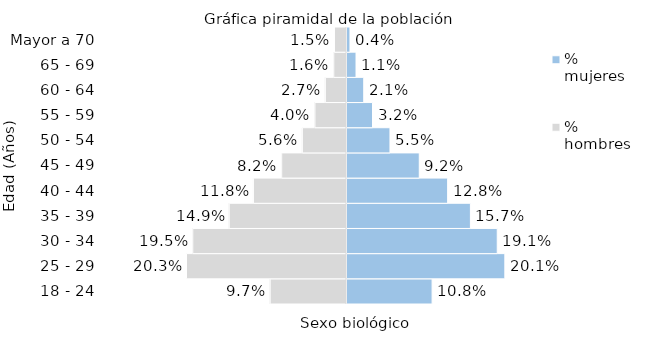
| Category | % hombres | % mujeres |
|---|---|---|
| 18 - 24 | -0.097 | 0.108 |
| 25 - 29 | -0.203 | 0.201 |
| 30 - 34 | -0.195 | 0.191 |
| 35 - 39 | -0.149 | 0.157 |
| 40 - 44 | -0.118 | 0.128 |
| 45 - 49 | -0.082 | 0.092 |
| 50 - 54 | -0.056 | 0.055 |
| 55 - 59 | -0.04 | 0.032 |
| 60 - 64 | -0.027 | 0.021 |
| 65 - 69 | -0.016 | 0.011 |
| Mayor a 70 | -0.015 | 0.004 |